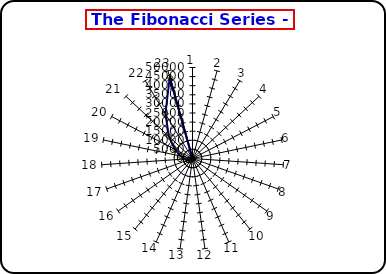
| Category | Series 0 |
|---|---|
| 0 | 1 |
| 1 | 2 |
| 2 | 3 |
| 3 | 5 |
| 4 | 8 |
| 5 | 13 |
| 6 | 21 |
| 7 | 34 |
| 8 | 55 |
| 9 | 89 |
| 10 | 144 |
| 11 | 233 |
| 12 | 377 |
| 13 | 610 |
| 14 | 987 |
| 15 | 1597 |
| 16 | 2584 |
| 17 | 4181 |
| 18 | 6765 |
| 19 | 10946 |
| 20 | 17711 |
| 21 | 28657 |
| 22 | 46368 |